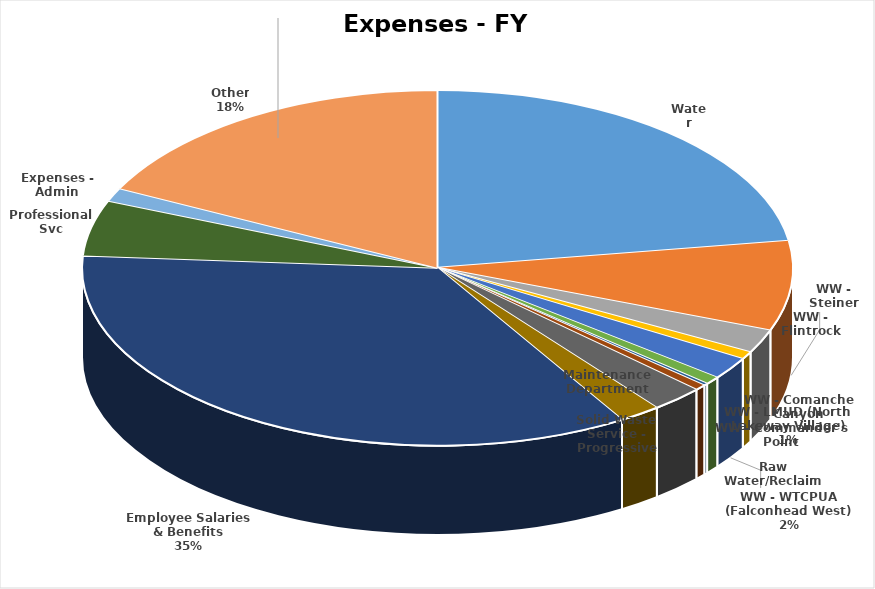
| Category | Series 0 | Series 1 |
|---|---|---|
| Water | 4325700 | 0.226 |
| WW - Steiner | 1565500 | 0.082 |
| WW - Flintrock | 412200 | 0.021 |
| WW - Comanche Canyon | 132900 | 0.007 |
| WW - WTCPUA (Falconhead West) | 387750 | 0.02 |
| WW - LMUD (North Lakeway Village) | 137500 | 0.007 |
| WW - Commander's Point | 36900 | 0.002 |
| Raw Water/Reclaim | 101500 | 0.005 |
| Solid Waste Service - Progressive | 459000 | 0.024 |
| Maintenance Department | 364000 | 0.019 |
| Employee Salaries & Benefits | 6671723 | 0.348 |
| Professional Svc | 970000 | 0.051 |
| Expenses - Admin | 232500 | 0.012 |
| Other | 3379522 | 0.176 |